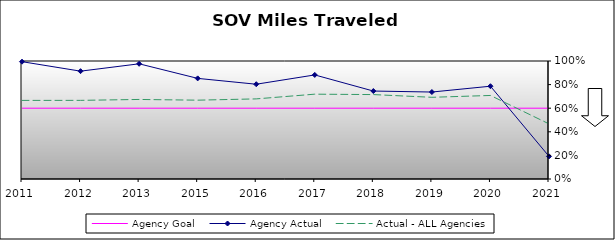
| Category | Agency Goal | Agency Actual | Actual - ALL Agencies |
|---|---|---|---|
| 2011.0 | 0.6 | 0.994 | 0.666 |
| 2012.0 | 0.6 | 0.914 | 0.666 |
| 2013.0 | 0.6 | 0.976 | 0.674 |
| 2015.0 | 0.6 | 0.853 | 0.668 |
| 2016.0 | 0.6 | 0.803 | 0.679 |
| 2017.0 | 0.6 | 0.882 | 0.719 |
| 2018.0 | 0.6 | 0.745 | 0.715 |
| 2019.0 | 0.6 | 0.737 | 0.692 |
| 2020.0 | 0.6 | 0.786 | 0.708 |
| 2021.0 | 0.6 | 0.192 | 0.467 |